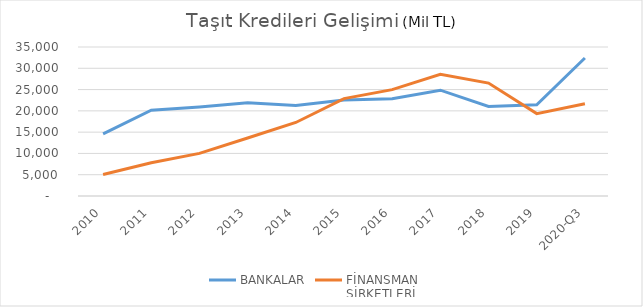
| Category | BANKALAR | FİNANSMAN 
ŞİRKETLERİ |
|---|---|---|
| 2010 | 14596 | 5035.89 |
| 2011 | 20160 | 7796.854 |
| 2012 | 20919 | 10009.755 |
| 2013 | 21906 | 13616.036 |
| 2014 | 21245 | 17271.844 |
| 2015 | 22567 | 22875.563 |
| 2016 | 22835 | 24980.231 |
| 2017 | 24852 | 28584.938 |
| 2018 | 21028 | 26527.133 |
| 2019 | 21426.2 | 19352.327 |
| 2020-Q3 | 32421.41 | 21690.45 |